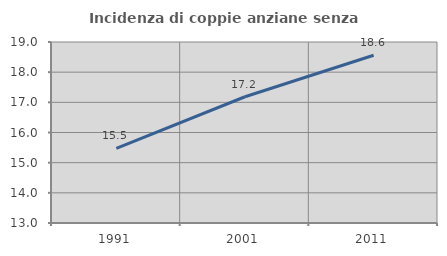
| Category | Incidenza di coppie anziane senza figli  |
|---|---|
| 1991.0 | 15.475 |
| 2001.0 | 17.185 |
| 2011.0 | 18.56 |